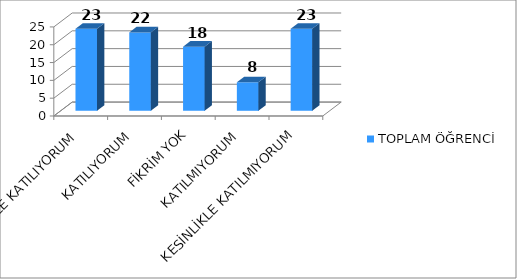
| Category | TOPLAM ÖĞRENCİ |
|---|---|
| KESİNLİKLE KATILIYORUM | 23 |
| KATILIYORUM | 22 |
| FİKRİM YOK | 18 |
| KATILMIYORUM | 8 |
| KESİNLİKLE KATILMIYORUM | 23 |